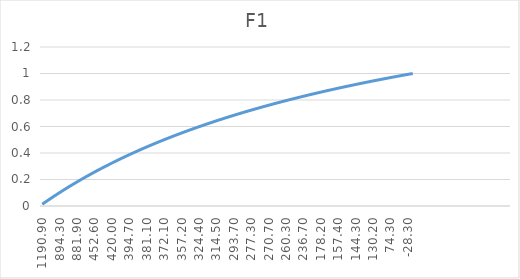
| Category | F1 |
|---|---|
| 1190.9 | 0.013 |
| 1190.9 | 0.026 |
| 1082.5 | 0.039 |
| 1080.7 | 0.052 |
| 1069.5 | 0.065 |
| 1069.5 | 0.077 |
| 932.0 | 0.089 |
| 894.3 | 0.101 |
| 888.2 | 0.113 |
| 887.9 | 0.125 |
| 884.9 | 0.137 |
| 884.1 | 0.148 |
| 883.2 | 0.16 |
| 882.8 | 0.171 |
| 881.9 | 0.182 |
| 875.8 | 0.193 |
| 874.3 | 0.204 |
| 550.6 | 0.214 |
| 514.8 | 0.225 |
| 512.2 | 0.235 |
| 496.0 | 0.246 |
| 452.6 | 0.256 |
| 437.7 | 0.266 |
| 435.4 | 0.276 |
| 430.8 | 0.286 |
| 428.9 | 0.295 |
| 426.3 | 0.305 |
| 421.2 | 0.315 |
| 420.0 | 0.324 |
| 410.3 | 0.333 |
| 404.5 | 0.343 |
| 402.2 | 0.352 |
| 400.4 | 0.361 |
| 396.4 | 0.37 |
| 395.6 | 0.378 |
| 394.7 | 0.387 |
| 394.3 | 0.396 |
| 389.2 | 0.404 |
| 388.8 | 0.413 |
| 384.7 | 0.421 |
| 382.1 | 0.429 |
| 381.5 | 0.438 |
| 381.1 | 0.446 |
| 380.6 | 0.454 |
| 377.4 | 0.462 |
| 377.4 | 0.469 |
| 374.3 | 0.477 |
| 373.9 | 0.485 |
| 373.3 | 0.492 |
| 372.1 | 0.5 |
| 369.0 | 0.507 |
| 367.6 | 0.515 |
| 366.2 | 0.522 |
| 359.6 | 0.529 |
| 358.8 | 0.537 |
| 358.6 | 0.544 |
| 357.2 | 0.551 |
| 355.2 | 0.558 |
| 354.3 | 0.565 |
| 352.1 | 0.571 |
| 342.8 | 0.578 |
| 332.9 | 0.585 |
| 330.7 | 0.592 |
| 324.4 | 0.598 |
| 324.2 | 0.605 |
| 324.1 | 0.611 |
| 323.4 | 0.618 |
| 321.8 | 0.624 |
| 315.9 | 0.63 |
| 314.5 | 0.636 |
| 314.5 | 0.643 |
| 314.3 | 0.649 |
| 312.1 | 0.655 |
| 310.9 | 0.661 |
| 305.0 | 0.667 |
| 296.9 | 0.673 |
| 294.1 | 0.678 |
| 293.7 | 0.684 |
| 292.8 | 0.69 |
| 287.3 | 0.696 |
| 284.7 | 0.701 |
| 281.0 | 0.707 |
| 278.7 | 0.712 |
| 278.7 | 0.718 |
| 277.3 | 0.723 |
| 276.8 | 0.729 |
| 276.6 | 0.734 |
| 276.2 | 0.739 |
| 271.5 | 0.745 |
| 271.3 | 0.75 |
| 270.9 | 0.755 |
| 270.7 | 0.76 |
| 270.6 | 0.765 |
| 270.1 | 0.77 |
| 267.0 | 0.776 |
| 267.0 | 0.78 |
| 265.3 | 0.785 |
| 262.7 | 0.79 |
| 260.3 | 0.795 |
| 258.9 | 0.8 |
| 254.7 | 0.805 |
| 253.8 | 0.81 |
| 253.0 | 0.814 |
| 242.1 | 0.819 |
| 239.3 | 0.824 |
| 236.7 | 0.828 |
| 236.4 | 0.833 |
| 232.3 | 0.837 |
| 220.8 | 0.842 |
| 214.1 | 0.846 |
| 209.2 | 0.851 |
| 178.6 | 0.855 |
| 178.2 | 0.859 |
| 174.7 | 0.864 |
| 173.1 | 0.868 |
| 172.3 | 0.872 |
| 172.2 | 0.876 |
| 165.7 | 0.881 |
| 160.7 | 0.885 |
| 157.4 | 0.889 |
| 157.2 | 0.893 |
| 156.9 | 0.897 |
| 154.3 | 0.901 |
| 153.7 | 0.905 |
| 153.5 | 0.909 |
| 144.3 | 0.913 |
| 144.3 | 0.917 |
| 144.3 | 0.921 |
| 143.7 | 0.925 |
| 140.9 | 0.929 |
| 140.9 | 0.932 |
| 140.6 | 0.936 |
| 132.6 | 0.94 |
| 130.2 | 0.944 |
| 121.6 | 0.947 |
| 115.2 | 0.951 |
| 106.1 | 0.955 |
| 88.3 | 0.958 |
| 82.1 | 0.962 |
| 74.9 | 0.966 |
| 74.3 | 0.969 |
| 58.5 | 0.973 |
| 48.9 | 0.976 |
| 33.9 | 0.98 |
| 15.9 | 0.983 |
| -6.3 | 0.986 |
| -19.5 | 0.99 |
| -28.3 | 0.993 |
| -32.1 | 0.997 |
| -209.5 | 1 |